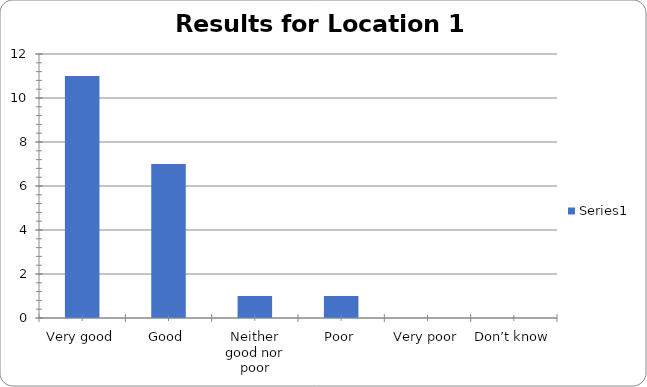
| Category | Series 0 |
|---|---|
| Very good | 11 |
| Good | 7 |
| Neither good nor poor | 1 |
| Poor | 1 |
| Very poor | 0 |
| Don’t know | 0 |